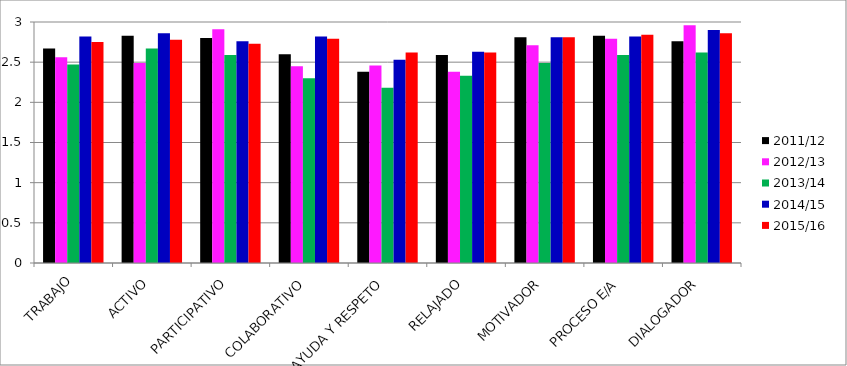
| Category | 2011/12 | 2012/13 | 2013/14 | 2014/15 | 2015/16 |
|---|---|---|---|---|---|
| TRABAJO | 2.67 | 2.56 | 2.47 | 2.82 | 2.75 |
| ACTIVO | 2.83 | 2.49 | 2.67 | 2.86 | 2.78 |
| PARTICIPATIVO | 2.8 | 2.91 | 2.59 | 2.76 | 2.73 |
| COLABORATIVO | 2.6 | 2.45 | 2.3 | 2.82 | 2.79 |
| AYUDA Y RESPETO | 2.38 | 2.46 | 2.18 | 2.53 | 2.62 |
| RELAJADO | 2.59 | 2.38 | 2.33 | 2.63 | 2.62 |
| MOTIVADOR | 2.81 | 2.71 | 2.49 | 2.81 | 2.81 |
| PROCESO E/A | 2.83 | 2.79 | 2.59 | 2.82 | 2.84 |
| DIALOGADOR | 2.76 | 2.96 | 2.62 | 2.9 | 2.86 |